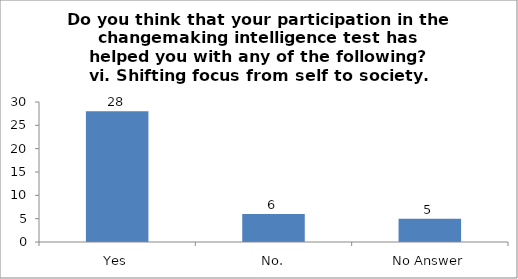
| Category | Do you think that your participation in the changemaking intelligence test has helped you with any of the following?
vi. Shifting focus from self to society. |
|---|---|
| Yes | 28 |
| No. | 6 |
| No Answer | 5 |